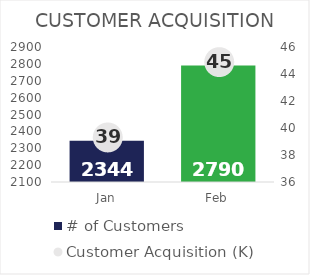
| Category | # of Customers |
|---|---|
| Jan | 2344 |
| Feb | 2790 |